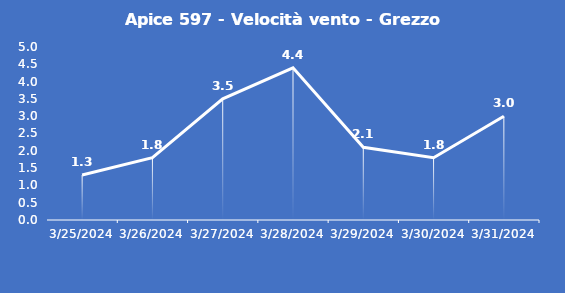
| Category | Apice 597 - Velocità vento - Grezzo (m/s) |
|---|---|
| 3/25/24 | 1.3 |
| 3/26/24 | 1.8 |
| 3/27/24 | 3.5 |
| 3/28/24 | 4.4 |
| 3/29/24 | 2.1 |
| 3/30/24 | 1.8 |
| 3/31/24 | 3 |